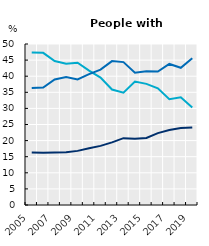
| Category | Low | Medium | High |
|---|---|---|---|
| 2005.0 | 47.381 | 36.299 | 16.32 |
| 2006.0 | 47.251 | 36.505 | 16.244 |
| 2007.0 | 44.734 | 38.985 | 16.281 |
| 2008.0 | 43.861 | 39.768 | 16.371 |
| 2009.0 | 44.174 | 39.018 | 16.808 |
| 2010.0 | 41.735 | 40.63 | 17.635 |
| 2011.0 | 39.585 | 42.05 | 18.365 |
| 2012.0 | 35.856 | 44.685 | 19.458 |
| 2013.0 | 34.865 | 44.371 | 20.764 |
| 2014.0 | 38.333 | 41.07 | 20.597 |
| 2015.0 | 37.625 | 41.558 | 20.817 |
| 2016.0 | 36.221 | 41.45 | 22.329 |
| 2017.0 | 32.883 | 43.807 | 23.31 |
| 2018.0 | 33.472 | 42.617 | 23.911 |
| 2019.0 | 30.291 | 45.605 | 24.104 |